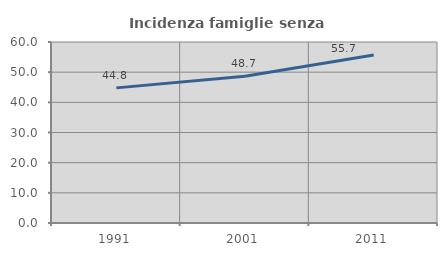
| Category | Incidenza famiglie senza nuclei |
|---|---|
| 1991.0 | 44.794 |
| 2001.0 | 48.655 |
| 2011.0 | 55.67 |